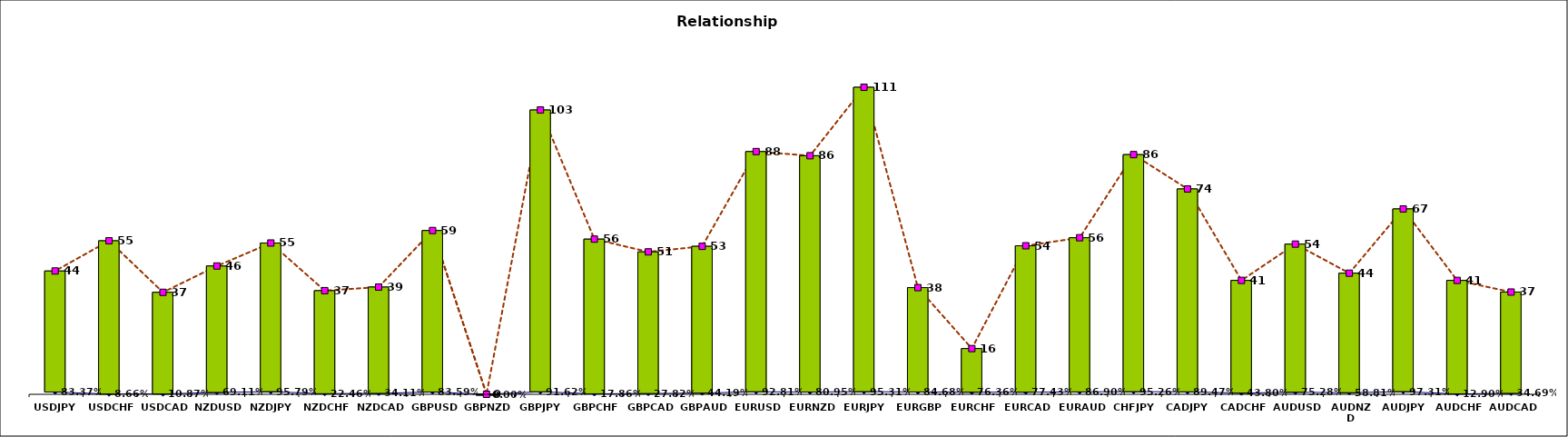
| Category | Bid Ratio | PiP Range |
|---|---|---|
| AUDCAD | 0.347 | 36.9 |
| AUDCHF | 0.129 | 41.1 |
| AUDJPY | 0.973 | 66.9 |
| AUDNZD | 0.588 | 43.7 |
| AUDUSD | 0.753 | 54.2 |
| CADCHF | 0.438 | 41.1 |
| CADJPY | 0.895 | 74.1 |
| CHFJPY | 0.953 | 86.5 |
| EURAUD | 0.869 | 56.5 |
| EURCAD | 0.774 | 53.6 |
| EURCHF | 0.764 | 16.5 |
| EURGBP | 0.847 | 38.5 |
| EURJPY | 0.953 | 110.8 |
| EURNZD | 0.81 | 86.1 |
| EURUSD | 0.928 | 87.6 |
| GBPAUD | 0.442 | 53.4 |
| GBPCAD | 0.278 | 51.4 |
| GBPCHF | 0.179 | 56 |
| GBPJPY | 0.916 | 102.6 |
| GBPNZD | 0 | 0 |
| GBPUSD | 0.836 | 59.1 |
| NZDCAD | 0.341 | 38.7 |
| NZDCHF | 0.225 | 37.4 |
| NZDJPY | 0.958 | 54.6 |
| NZDUSD | 0.691 | 46.3 |
| USDCAD | 0.109 | 36.8 |
| USDCHF | 0.087 | 55.4 |
| USDJPY | 0.834 | 44.5 |